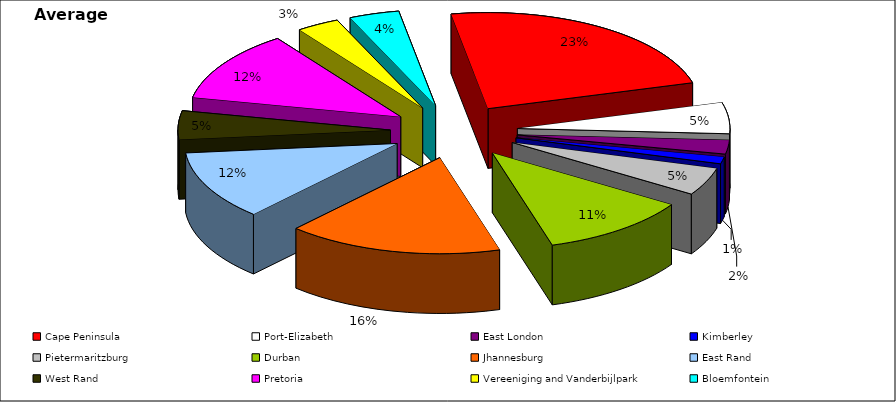
| Category | Average 1990 |
|---|---|
| Cape Peninsula | 11429.333 |
| Port-Elizabeth | 2548.083 |
| East London | 1138.75 |
| Kimberley | 566.25 |
| Pietermaritzburg | 2277.667 |
| Durban | 5568.25 |
| Jhannesburg | 7985.917 |
| East Rand | 5664.5 |
| West Rand | 2343.667 |
| Pretoria | 5816.333 |
| Vereeniging and Vanderbijlpark | 1587.75 |
| Bloemfontein | 1859.5 |